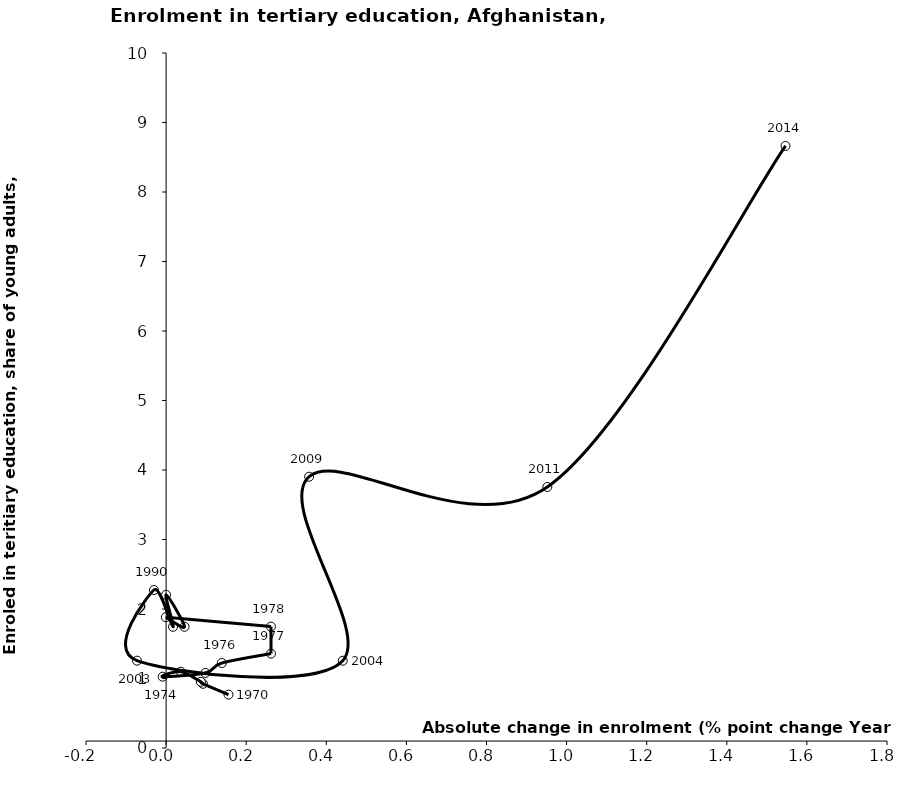
| Category | Series 0 |
|---|---|
| 0.155770003795623 | 0.768 |
| 0.092119991779327 | 0.924 |
| 0.08675500750541854 | 0.952 |
| 0.03689503669738803 | 1.097 |
| -0.008665025234224966 | 1.026 |
| 0.09821999073028498 | 1.08 |
| 0.13907504081725997 | 1.223 |
| 0.26198500394821 | 1.358 |
| 0.261759996414185 | 1.747 |
| -0.0006225109100325144 | 1.882 |
| 0.04607284069061283 | 1.744 |
| -0.00013799667358398436 | 2.204 |
| 0.017217516899109997 | 1.743 |
| -0.030411876738071872 | 2.273 |
| -0.07265285934720712 | 1.257 |
| 0.44109165668487665 | 1.256 |
| 0.3571357216153829 | 3.903 |
| 0.9518819808959961 | 3.756 |
| 1.5466282401766094 | 8.663 |